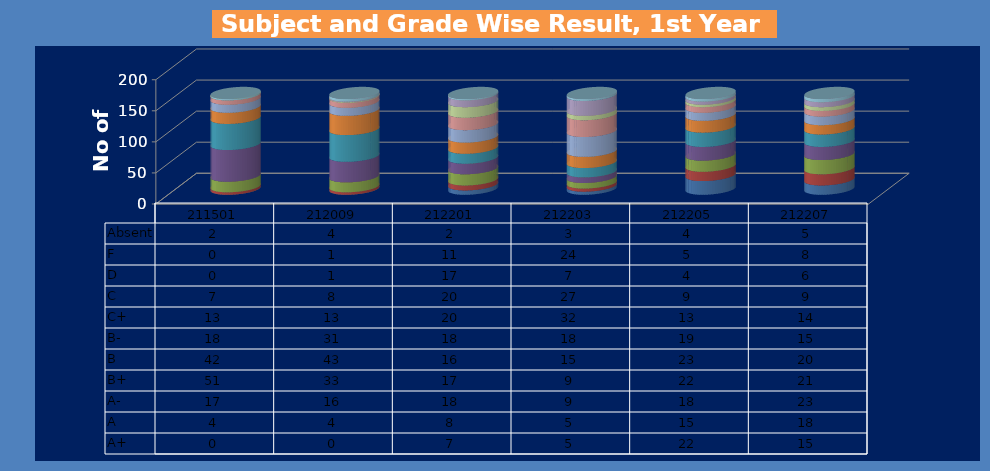
| Category | A+ | A | A- | B+ | B | B- | C+ | C | D | F | Absent |
|---|---|---|---|---|---|---|---|---|---|---|---|
| 211501.0 | 0 | 4 | 17 | 51 | 42 | 18 | 13 | 7 | 0 | 0 | 2 |
| 212009.0 | 0 | 4 | 16 | 33 | 43 | 31 | 13 | 8 | 1 | 1 | 4 |
| 212201.0 | 7 | 8 | 18 | 17 | 16 | 18 | 20 | 20 | 17 | 11 | 2 |
| 212203.0 | 5 | 5 | 9 | 9 | 15 | 18 | 32 | 27 | 7 | 24 | 3 |
| 212205.0 | 22 | 15 | 18 | 22 | 23 | 19 | 13 | 9 | 4 | 5 | 4 |
| 212207.0 | 15 | 18 | 23 | 21 | 20 | 15 | 14 | 9 | 6 | 8 | 5 |